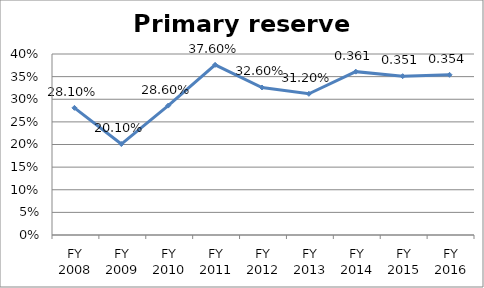
| Category | Primary reserve ratio |
|---|---|
| FY 2016 | 0.354 |
| FY 2015 | 0.351 |
| FY 2014 | 0.361 |
| FY 2013 | 0.312 |
| FY 2012 | 0.326 |
| FY 2011 | 0.376 |
| FY 2010 | 0.286 |
| FY 2009 | 0.201 |
| FY 2008 | 0.281 |